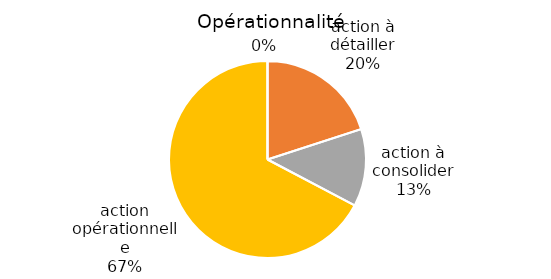
| Category | Series 0 |
|---|---|
|  | 0 |
| action à détailler | 0.2 |
| action à consolider | 0.127 |
| action opérationnelle | 0.673 |